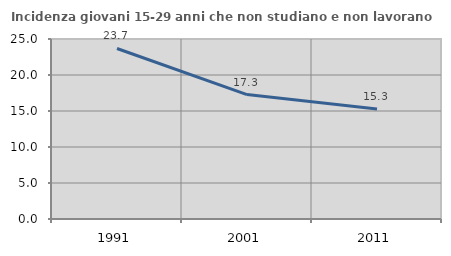
| Category | Incidenza giovani 15-29 anni che non studiano e non lavorano  |
|---|---|
| 1991.0 | 23.684 |
| 2001.0 | 17.285 |
| 2011.0 | 15.266 |